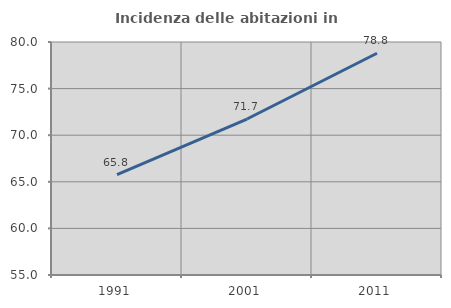
| Category | Incidenza delle abitazioni in proprietà  |
|---|---|
| 1991.0 | 65.771 |
| 2001.0 | 71.736 |
| 2011.0 | 78.792 |